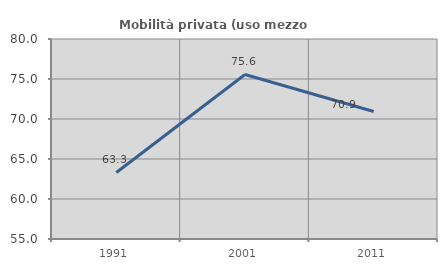
| Category | Mobilità privata (uso mezzo privato) |
|---|---|
| 1991.0 | 63.317 |
| 2001.0 | 75.568 |
| 2011.0 | 70.936 |